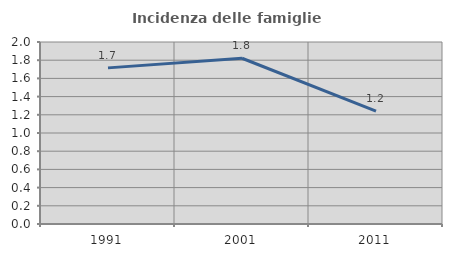
| Category | Incidenza delle famiglie numerose |
|---|---|
| 1991.0 | 1.716 |
| 2001.0 | 1.821 |
| 2011.0 | 1.24 |